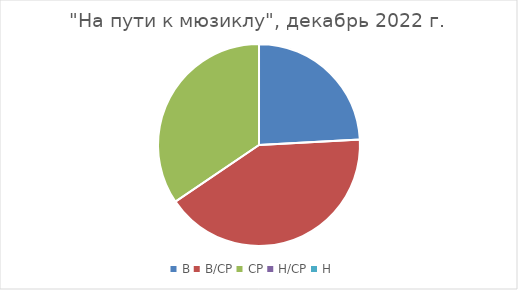
| Category | "На пути к мюзиклу" |
|---|---|
| В | 7 |
| В/СР | 12 |
| СР | 10 |
| Н/СР | 0 |
| Н | 0 |